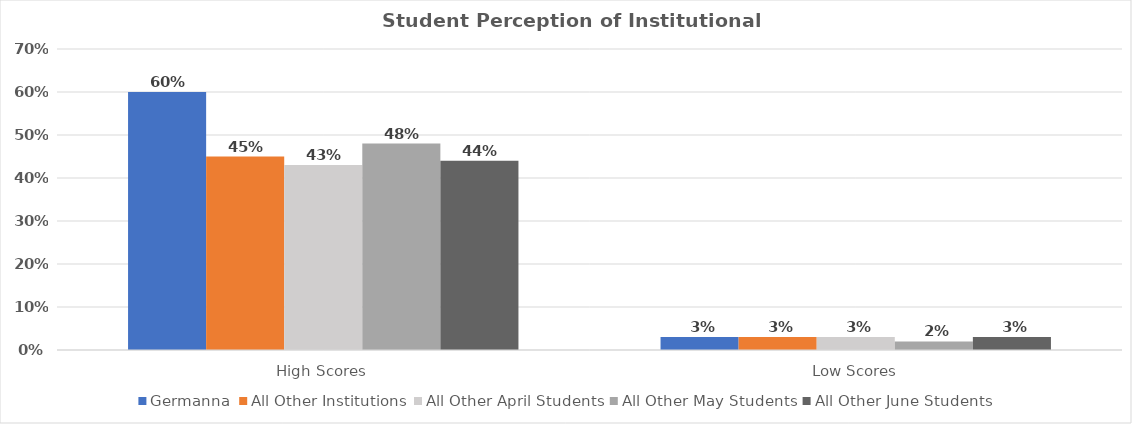
| Category | Germanna | All Other Institutions | All Other April Students | All Other May Students | All Other June Students |
|---|---|---|---|---|---|
| High Scores | 0.6 | 0.45 | 0.43 | 0.48 | 0.44 |
| Low Scores | 0.03 | 0.03 | 0.03 | 0.02 | 0.03 |